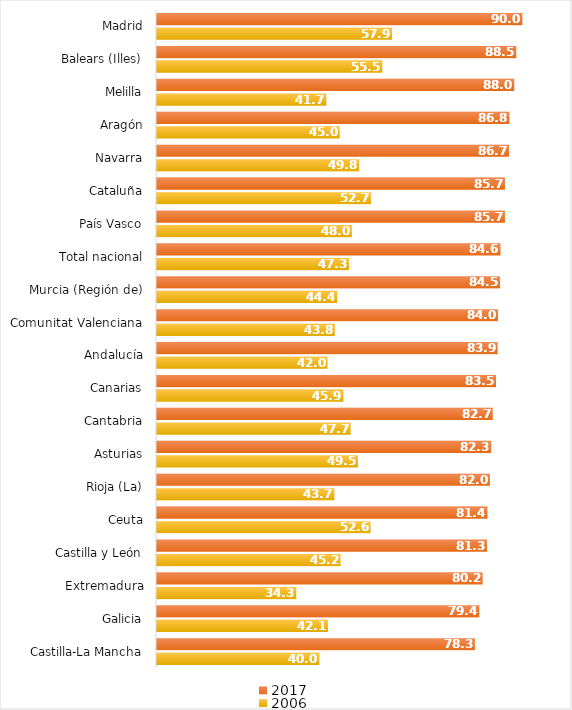
| Category | 2017 | 2006 |
|---|---|---|
| Madrid | 90 | 57.9 |
| Balears (Illes) | 88.5 | 55.5 |
| Melilla | 88 | 41.7 |
| Aragón | 86.8 | 45 |
| Navarra | 86.7 | 49.8 |
| Cataluña | 85.7 | 52.7 |
| País Vasco | 85.7 | 48 |
| Total nacional | 84.6 | 47.3 |
| Murcia (Región de) | 84.5 | 44.4 |
| Comunitat Valenciana | 84 | 43.8 |
| Andalucía | 83.9 | 42 |
| Canarias | 83.5 | 45.9 |
| Cantabria | 82.7 | 47.7 |
| Asturias | 82.3 | 49.5 |
| Rioja (La) | 82 | 43.7 |
| Ceuta | 81.4 | 52.6 |
| Castilla y León | 81.3 | 45.2 |
| Extremadura | 80.2 | 34.3 |
| Galicia | 79.4 | 42.1 |
| Castilla-La Mancha | 78.3 | 40 |